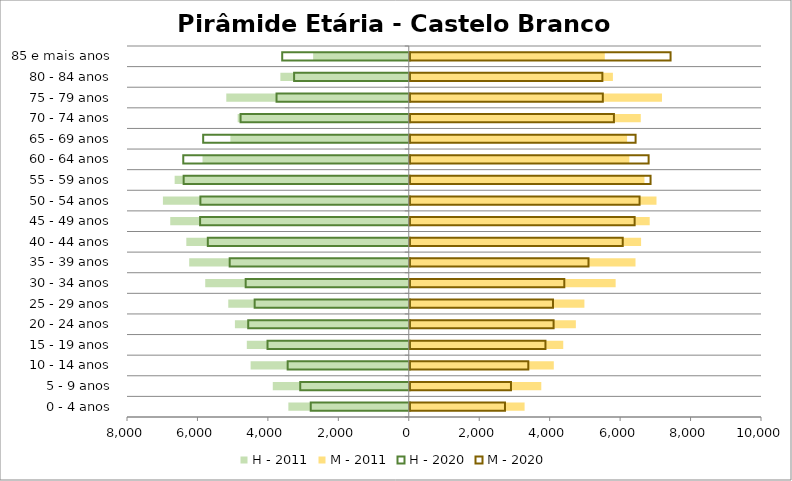
| Category | H - 2011 | M - 2011 | H - 2020 | M - 2020 |
|---|---|---|---|---|
| 0 - 4 anos | -3419 | 3260 | -2812 | 2703 |
| 5 - 9 anos | -3861 | 3734 | -3110 | 2873 |
| 10 - 14 anos | -4490 | 4089 | -3467 | 3365 |
| 15 - 19 anos | -4598 | 4357 | -4039 | 3852 |
| 20 - 24 anos | -4936 | 4715 | -4587 | 4083 |
| 25 - 29 anos | -5125 | 4958 | -4404 | 4066 |
| 30 - 34 anos | -5779 | 5845 | -4659 | 4387 |
| 35 - 39 anos | -6234 | 6409 | -5113 | 5074 |
| 40 - 44 anos | -6316 | 6567 | -5734 | 6046 |
| 45 - 49 anos | -6772 | 6812 | -5953 | 6384 |
| 50 - 54 anos | -6980 | 7005 | -5945 | 6524 |
| 55 - 59 anos | -6647 | 6663 | -6420 | 6836 |
| 60 - 64 anos | -5856 | 6234 | -6431 | 6781 |
| 65 - 69 anos | -5065 | 6170 | -5866 | 6411 |
| 70 - 74 anos | -4858 | 6559 | -4804 | 5796 |
| 75 - 79 anos | -5181 | 7160 | -3783 | 5481 |
| 80 - 84 anos | -3645 | 5767 | -3284 | 5468 |
| 85 e mais anos | -2715 | 5537 | -3622 | 7404 |